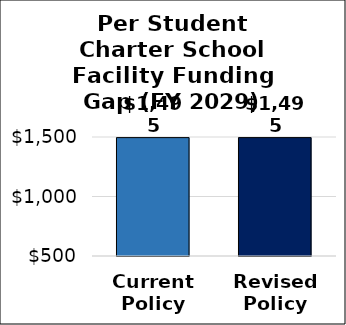
| Category | Per Student Facility Funding Gap |
|---|---|
| Current
Policy | 1494.767 |
| Revised
Policy | 1494.767 |